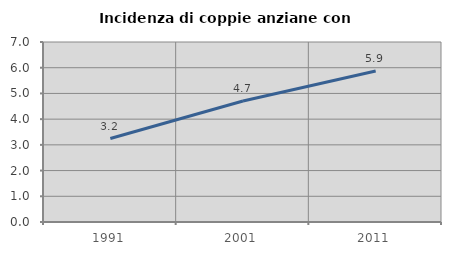
| Category | Incidenza di coppie anziane con figli |
|---|---|
| 1991.0 | 3.245 |
| 2001.0 | 4.703 |
| 2011.0 | 5.874 |